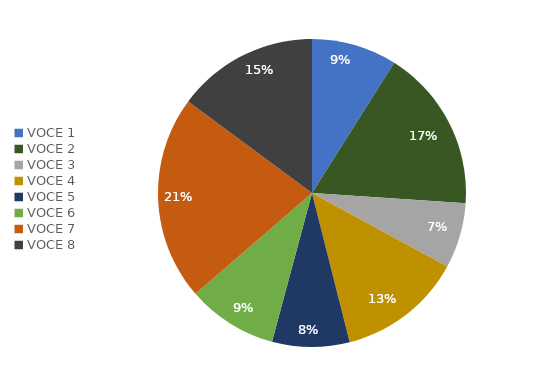
| Category | Series 0 | Series 1 |
|---|---|---|
| VOCE 1 | 0.09 | 0.09 |
| VOCE 2 | 0.171 | 0.171 |
| VOCE 3 | 0.069 | 0.069 |
| VOCE 4 | 0.131 | 0.131 |
| VOCE 5 | 0.081 | 0.081 |
| VOCE 6 | 0.095 | 0.095 |
| VOCE 7 | 0.215 | 0.215 |
| VOCE 8 | 0.149 | 0.149 |